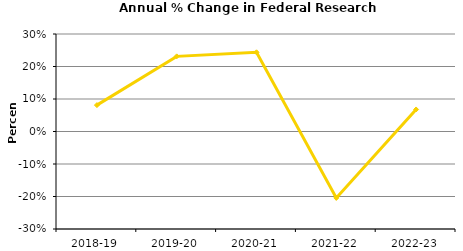
| Category | Series 0 |
|---|---|
| 2018-19 | 0.081 |
| 2019-20 | 0.231 |
| 2020-21 | 0.244 |
| 2021-22 | -0.204 |
| 2022-23 | 0.068 |